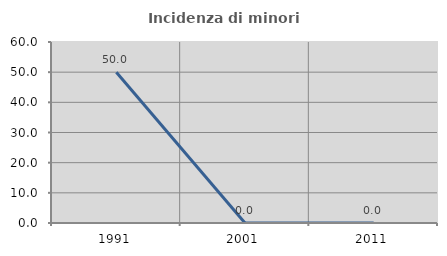
| Category | Incidenza di minori stranieri |
|---|---|
| 1991.0 | 50 |
| 2001.0 | 0 |
| 2011.0 | 0 |